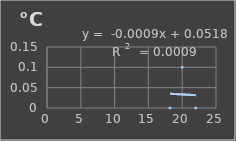
| Category | Temperatura |
|---|---|
| 18.2 | 0 |
| 20.0 | 0.1 |
| 22.0 | 0 |